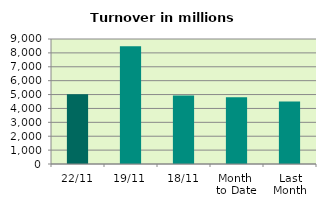
| Category | Series 0 |
|---|---|
| 22/11 | 5017.58 |
| 19/11 | 8482.856 |
| 18/11 | 4938.401 |
| Month 
to Date | 4804.238 |
| Last
Month | 4491.272 |